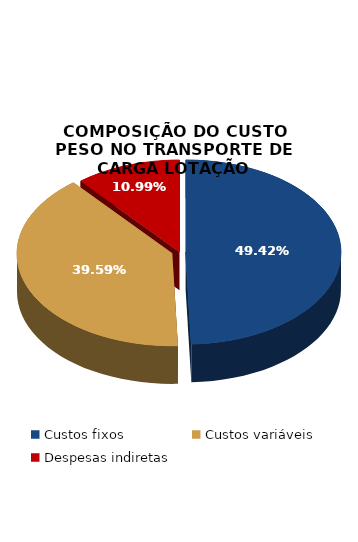
| Category | COMPOSIÇÃO DO CUSTO PESO NO TRANSPORTE DE CARGA LOTAÇÃO |
|---|---|
| Custos fixos | 0.494 |
| Custos variáveis | 0.396 |
| Despesas indiretas | 0.11 |